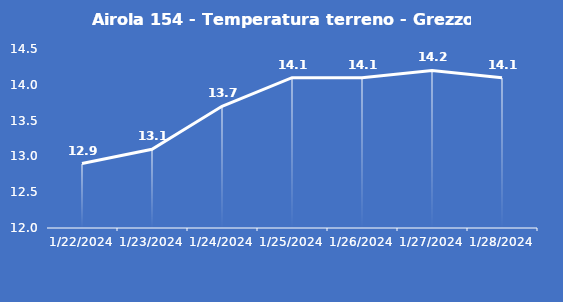
| Category | Airola 154 - Temperatura terreno - Grezzo (°C) |
|---|---|
| 1/22/24 | 12.9 |
| 1/23/24 | 13.1 |
| 1/24/24 | 13.7 |
| 1/25/24 | 14.1 |
| 1/26/24 | 14.1 |
| 1/27/24 | 14.2 |
| 1/28/24 | 14.1 |